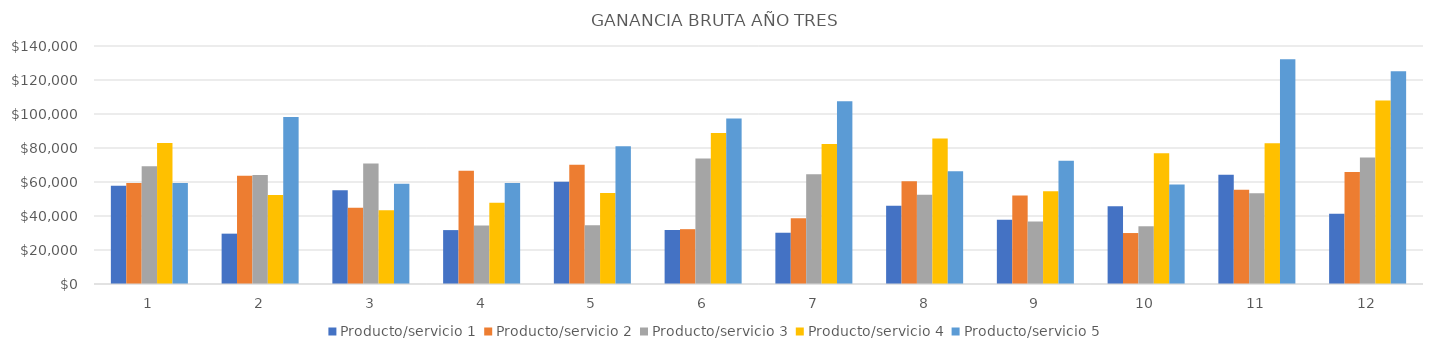
| Category | Producto/servicio 1 | Producto/servicio 2 | Producto/servicio 3 | Producto/servicio 4 | Producto/servicio 5 |
|---|---|---|---|---|---|
| 0 | 57836.6 | 59440 | 69246 | 82984 | 59413.5 |
| 1 | 29614.1 | 63648 | 64143 | 52347.6 | 98185.5 |
| 2 | 55166.4 | 44895 | 70812 | 43367.7 | 58932.5 |
| 3 | 31708.8 | 66690.6 | 34479 | 47752.2 | 59427.5 |
| 4 | 60206.4 | 70077.2 | 34560 | 53457.6 | 81075 |
| 5 | 31779.6 | 32250.6 | 73809 | 88777.8 | 97290 |
| 6 | 30153.7 | 38663 | 64629 | 82350.9 | 107459.5 |
| 7 | 46071.9 | 60368.4 | 52452 | 85547.7 | 66308.5 |
| 8 | 37793.3 | 52053.6 | 36738 | 54600.9 | 72485.5 |
| 9 | 45727.2 | 29979.2 | 33957 | 76889.7 | 58522 |
| 10 | 64291.5 | 55457.4 | 53364 | 82752.7 | 132151.5 |
| 11 | 41314 | 65830.8 | 74340 | 108009.5 | 125209.5 |